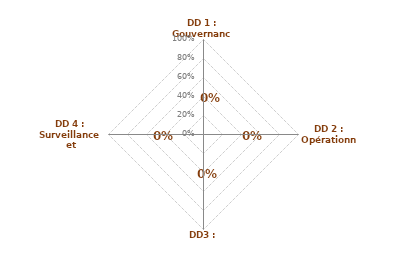
| Category | Maîtrise estimée des DOSSIERS DOCUMENTAIRES (DD) |
|---|---|
| DD 1 : Gouvernance | 0 |
| DD 2 : Opérationnel | 0 |
| DD3 : Support | 0 |
| DD 4 : Surveillance et Amélioration | 0 |